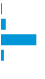
| Category | Series 0 |
|---|---|
| 0 | 0.001 |
| 1 | 0.094 |
| 2 | 0.858 |
| 3 | 0.048 |